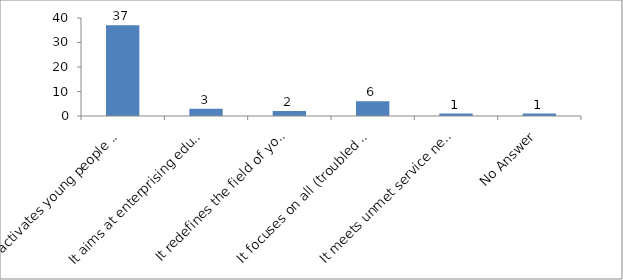
| Category | What did you like the most about the concept of Youth-led Changemaking? |
|---|---|
| It activates young people as changemakers | 37 |
| It aims at enterprising education | 3 |
| It redefines the field of youth development | 2 |
| It focuses on all (troubled and prepared) young people | 6 |
| It meets unmet service needs of the society | 1 |
| No Answer | 1 |